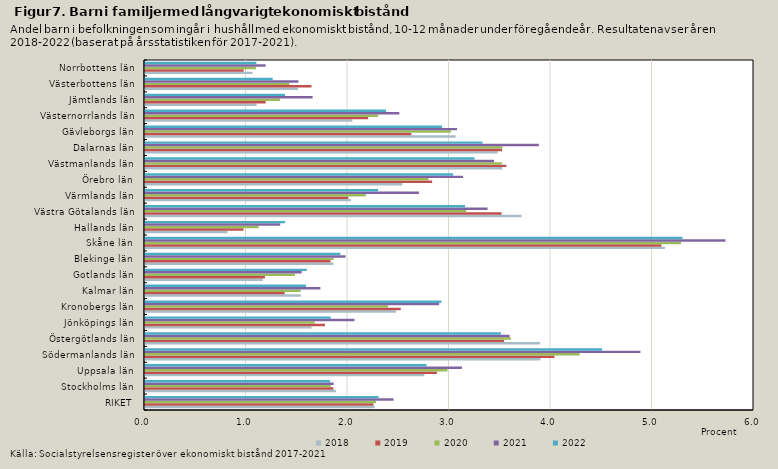
| Category | 2018 | 2019 | 2020 | 2021 | 2022 |
|---|---|---|---|---|---|
| RIKET | 2.262 | 2.251 | 2.277 | 2.449 | 2.301 |
| Stockholms län | 1.881 | 1.855 | 1.831 | 1.859 | 1.823 |
| Uppsala län | 2.752 | 2.876 | 2.981 | 3.123 | 2.774 |
| Södermanlands län | 3.897 | 4.034 | 4.282 | 4.881 | 4.503 |
| Östergötlands län | 3.893 | 3.537 | 3.605 | 3.592 | 3.507 |
| Jönköpings län | 1.641 | 1.773 | 1.672 | 2.063 | 1.83 |
| Kronobergs län | 2.472 | 2.52 | 2.394 | 2.897 | 2.919 |
| Kalmar län | 1.535 | 1.375 | 1.534 | 1.728 | 1.586 |
| Gotlands län | 1.159 | 1.182 | 1.478 | 1.543 | 1.594 |
| Blekinge län | 1.856 | 1.827 | 1.859 | 1.975 | 1.924 |
| Skåne län | 5.122 | 5.088 | 5.281 | 5.718 | 5.295 |
| Hallands län | 0.813 | 0.971 | 1.12 | 1.332 | 1.38 |
| Västra Götalands län | 3.709 | 3.513 | 3.165 | 3.375 | 3.153 |
| Värmlands län | 2.028 | 2.004 | 2.176 | 2.699 | 2.296 |
| Örebro län | 2.535 | 2.829 | 2.794 | 3.134 | 3.035 |
| Västmanlands län | 3.521 | 3.56 | 3.515 | 3.439 | 3.247 |
| Dalarnas län | 3.475 | 3.517 | 3.522 | 3.88 | 3.325 |
| Gävleborgs län | 3.06 | 2.624 | 3.014 | 3.074 | 2.927 |
| Västernorrlands län | 2.042 | 2.199 | 2.297 | 2.506 | 2.375 |
| Jämtlands län | 1.099 | 1.189 | 1.331 | 1.651 | 1.379 |
| Västerbottens län | 1.507 | 1.64 | 1.423 | 1.512 | 1.258 |
| Norrbottens län | 1.059 | 0.972 | 1.092 | 1.188 | 1.098 |